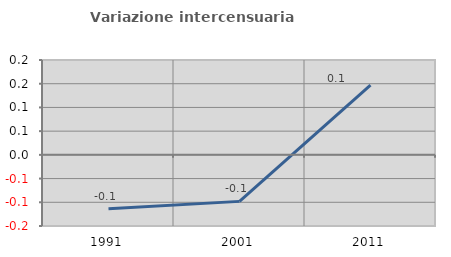
| Category | Variazione intercensuaria annua |
|---|---|
| 1991.0 | -0.114 |
| 2001.0 | -0.098 |
| 2011.0 | 0.147 |